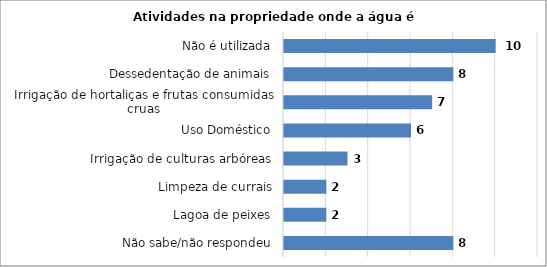
| Category | Series 0 |
|---|---|
| Não sabe/não respondeu | 8 |
| Lagoa de peixes | 2 |
| Limpeza de currais | 2 |
| Irrigação de culturas arbóreas | 3 |
| Uso Doméstico | 6 |
| Irrigação de hortaliças e frutas consumidas cruas | 7 |
| Dessedentação de animais | 8 |
| Não é utilizada | 10 |